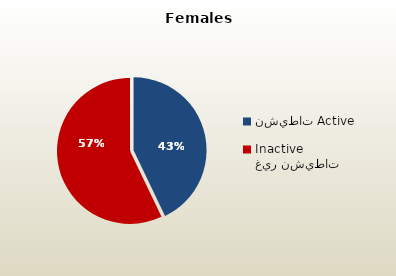
| Category | الاناث القطريات  Qatari Females |
|---|---|
| نشيطات Active | 48244 |
| غير نشيطات Inactive | 64218 |